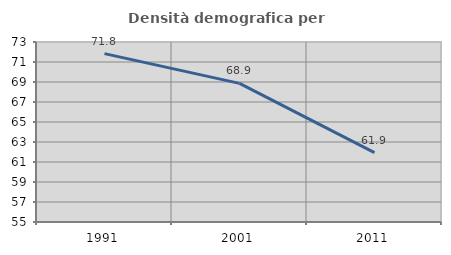
| Category | Densità demografica |
|---|---|
| 1991.0 | 71.837 |
| 2001.0 | 68.863 |
| 2011.0 | 61.936 |